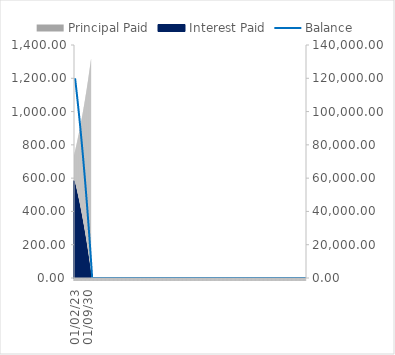
| Category | Principal Paid | Interest Paid |
|---|---|---|
| 01/02/23 | 738.582 | 584.106 |
| 01/03/23 | 742.177 | 580.511 |
| 01/04/23 | 745.79 | 576.898 |
| 01/05/23 | 749.42 | 573.268 |
| 01/06/23 | 753.068 | 569.62 |
| 01/07/23 | 756.734 | 565.955 |
| 01/08/23 | 760.417 | 562.271 |
| 01/09/23 | 764.118 | 558.57 |
| 01/10/23 | 767.838 | 554.851 |
| 01/11/23 | 771.575 | 551.113 |
| 01/12/23 | 775.331 | 547.357 |
| 01/01/24 | 779.105 | 543.583 |
| 01/02/24 | 782.897 | 539.791 |
| 01/03/24 | 786.708 | 535.98 |
| 01/04/24 | 790.537 | 532.151 |
| 01/05/24 | 794.385 | 528.303 |
| 01/06/24 | 798.252 | 524.436 |
| 01/07/24 | 802.138 | 520.551 |
| 01/08/24 | 806.042 | 516.646 |
| 01/09/24 | 809.965 | 512.723 |
| 01/10/24 | 813.908 | 508.78 |
| 01/11/24 | 817.87 | 504.819 |
| 01/12/24 | 821.851 | 500.838 |
| 01/01/25 | 825.851 | 496.837 |
| 01/02/25 | 829.871 | 492.817 |
| 01/03/25 | 833.91 | 488.778 |
| 01/04/25 | 837.97 | 484.719 |
| 01/05/25 | 842.048 | 480.64 |
| 01/06/25 | 846.147 | 476.541 |
| 01/07/25 | 850.266 | 472.423 |
| 01/08/25 | 854.404 | 468.284 |
| 01/09/25 | 858.563 | 464.125 |
| 01/10/25 | 862.742 | 459.946 |
| 01/11/25 | 866.942 | 455.746 |
| 01/12/25 | 871.162 | 451.527 |
| 01/01/26 | 875.402 | 447.286 |
| 01/02/26 | 879.663 | 443.025 |
| 01/03/26 | 883.945 | 438.743 |
| 01/04/26 | 888.248 | 434.441 |
| 01/05/26 | 892.571 | 430.117 |
| 01/06/26 | 896.916 | 425.772 |
| 01/07/26 | 901.282 | 421.407 |
| 01/08/26 | 905.669 | 417.02 |
| 01/09/26 | 910.077 | 412.611 |
| 01/10/26 | 914.507 | 408.181 |
| 01/11/26 | 918.958 | 403.73 |
| 01/12/26 | 923.431 | 399.257 |
| 01/01/27 | 927.926 | 394.762 |
| 01/02/27 | 932.443 | 390.245 |
| 01/03/27 | 936.982 | 385.707 |
| 01/04/27 | 941.543 | 381.146 |
| 01/05/27 | 946.126 | 376.563 |
| 01/06/27 | 950.731 | 371.957 |
| 01/07/27 | 955.359 | 367.33 |
| 01/08/27 | 960.009 | 362.679 |
| 01/09/27 | 964.682 | 358.007 |
| 01/10/27 | 969.377 | 353.311 |
| 01/11/27 | 974.096 | 348.592 |
| 01/12/27 | 978.837 | 343.851 |
| 01/01/28 | 983.602 | 339.086 |
| 01/02/28 | 988.39 | 334.299 |
| 01/03/28 | 993.201 | 329.488 |
| 01/04/28 | 998.035 | 324.653 |
| 01/05/28 | 1002.893 | 319.795 |
| 01/06/28 | 1007.775 | 314.914 |
| 01/07/28 | 1012.68 | 310.008 |
| 01/08/28 | 1017.609 | 305.079 |
| 01/09/28 | 1022.563 | 300.126 |
| 01/10/28 | 1027.54 | 295.148 |
| 01/11/28 | 1032.542 | 290.147 |
| 01/12/28 | 1037.568 | 285.121 |
| 01/01/29 | 1042.618 | 280.07 |
| 01/02/29 | 1047.693 | 274.995 |
| 01/03/29 | 1052.793 | 269.896 |
| 01/04/29 | 1057.917 | 264.771 |
| 01/05/29 | 1063.067 | 259.622 |
| 01/06/29 | 1068.241 | 254.447 |
| 01/07/29 | 1073.441 | 249.247 |
| 01/08/29 | 1078.666 | 244.022 |
| 01/09/29 | 1083.916 | 238.772 |
| 01/10/29 | 1089.192 | 233.496 |
| 01/11/29 | 1094.494 | 228.194 |
| 01/12/29 | 1099.822 | 222.867 |
| 01/01/30 | 1105.175 | 217.513 |
| 01/02/30 | 1110.555 | 212.134 |
| 01/03/30 | 1115.96 | 206.728 |
| 01/04/30 | 1121.392 | 201.296 |
| 01/05/30 | 1126.851 | 195.838 |
| 01/06/30 | 1132.336 | 190.353 |
| 01/07/30 | 1137.847 | 184.841 |
| 01/08/30 | 1143.386 | 179.302 |
| 01/09/30 | 1148.951 | 173.737 |
| 01/10/30 | 1154.544 | 168.144 |
| 01/11/30 | 1160.164 | 162.524 |
| 01/12/30 | 1165.811 | 156.877 |
| 01/01/31 | 1171.486 | 151.203 |
| 01/02/31 | 1177.188 | 145.5 |
| 01/03/31 | 1182.918 | 139.77 |
| 01/04/31 | 1188.676 | 134.012 |
| 01/05/31 | 1194.462 | 128.227 |
| 01/06/31 | 1200.276 | 122.412 |
| 01/07/31 | 1206.118 | 116.57 |
| 01/08/31 | 1211.989 | 110.699 |
| 01/09/31 | 1217.889 | 104.8 |
| 01/10/31 | 1223.817 | 98.872 |
| 01/11/31 | 1229.774 | 92.915 |
| 01/12/31 | 1235.76 | 86.929 |
| 01/01/32 | 1241.775 | 80.914 |
| 01/02/32 | 1247.819 | 74.869 |
| 01/03/32 | 1253.893 | 68.795 |
| 01/04/32 | 1259.996 | 62.692 |
| 01/05/32 | 1266.129 | 56.559 |
| 01/06/32 | 1272.292 | 50.396 |
| 01/07/32 | 1278.485 | 44.203 |
| 01/08/32 | 1284.708 | 37.98 |
| 01/09/32 | 1290.962 | 31.726 |
| 01/10/32 | 1297.246 | 25.443 |
| 01/11/32 | 1303.56 | 19.128 |
| 01/12/32 | 1309.905 | 12.783 |
| 01/01/33 | 1316.281 | 6.407 |